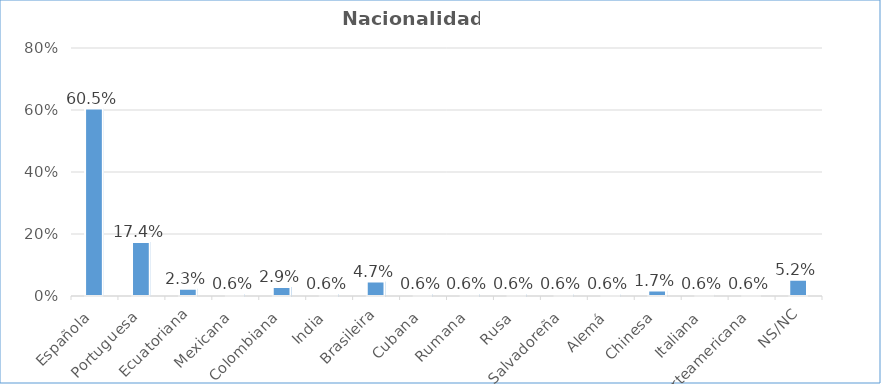
| Category | % das respostas |
|---|---|
| Española | 0.605 |
| Portuguesa | 0.174 |
| Ecuatoriana | 0.023 |
| Mexicana | 0.006 |
| Colombiana | 0.029 |
| India | 0.006 |
| Brasileira | 0.047 |
| Cubana | 0.006 |
| Rumana | 0.006 |
| Rusa | 0.006 |
| Salvadoreña | 0.006 |
| Alemá | 0.006 |
| Chinesa | 0.017 |
| Italiana | 0.006 |
| Norteamericana | 0.006 |
| NS/NC | 0.052 |